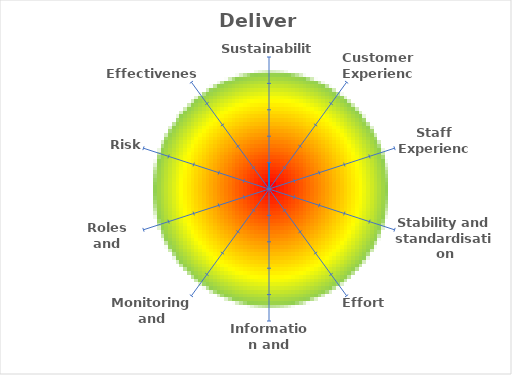
| Category | Delivery |
|---|---|
| Sustainability | 1 |
| Customer Experience | 0 |
| Staff Experience | 0 |
| Stability and standardisation | 0 |
| Effort | 0 |
| Information and records | 0 |
| Monitoring and oversight | 0 |
| Roles and resources | 0 |
| Risk | 0 |
| Effectiveness | 0 |